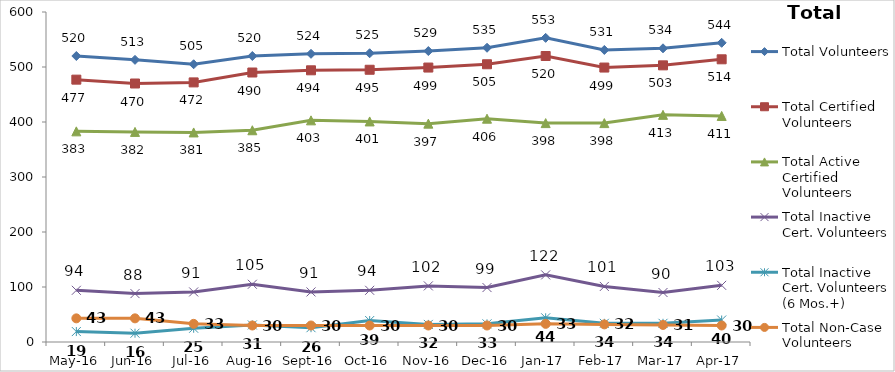
| Category | Total Volunteers | Total Certified Volunteers | Total Active Certified Volunteers | Total Inactive Cert. Volunteers | Total Inactive Cert. Volunteers (6 Mos.+) | Total Non-Case Volunteers |
|---|---|---|---|---|---|---|
| May-16 | 520 | 477 | 383 | 94 | 19 | 43 |
| Jun-16 | 513 | 470 | 382 | 88 | 16 | 43 |
| Jul-16 | 505 | 472 | 381 | 91 | 25 | 33 |
| Aug-16 | 520 | 490 | 385 | 105 | 31 | 30 |
| Sep-16 | 524 | 494 | 403 | 91 | 26 | 30 |
| Oct-16 | 525 | 495 | 401 | 94 | 39 | 30 |
| Nov-16 | 529 | 499 | 397 | 102 | 32 | 30 |
| Dec-16 | 535 | 505 | 406 | 99 | 33 | 30 |
| Jan-17 | 553 | 520 | 398 | 122 | 44 | 33 |
| Feb-17 | 531 | 499 | 398 | 101 | 34 | 32 |
| Mar-17 | 534 | 503 | 413 | 90 | 34 | 31 |
| Apr-17 | 544 | 514 | 411 | 103 | 40 | 30 |